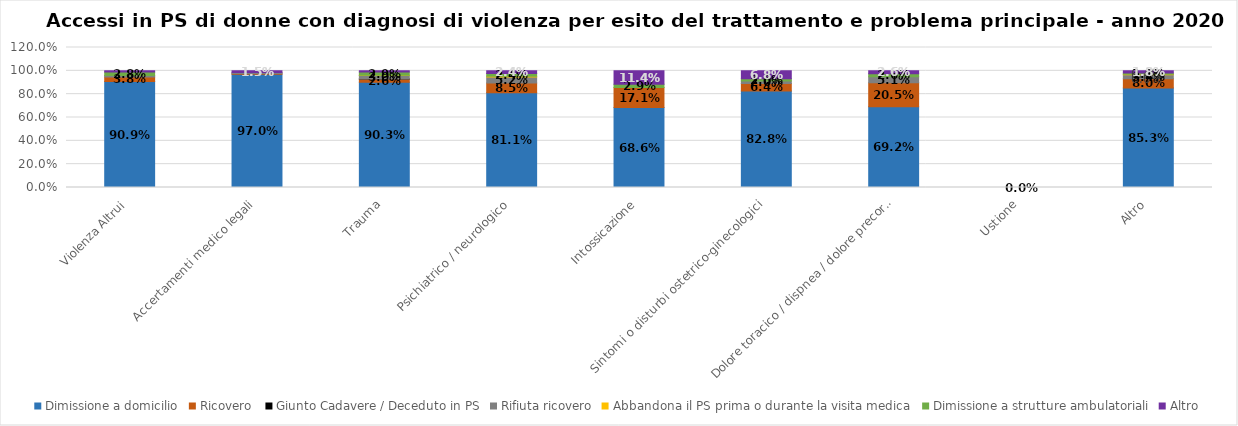
| Category | Dimissione a domicilio | Ricovero  | Giunto Cadavere / Deceduto in PS | Rifiuta ricovero | Abbandona il PS prima o durante la visita medica  | Dimissione a strutture ambulatoriali | Altro |
|---|---|---|---|---|---|---|---|
| Violenza Altrui | 0.909 | 0.038 | 0 | 0.014 | 0 | 0.028 | 0.011 |
| Accertamenti medico legali | 0.97 | 0.007 | 0 | 0.007 | 0 | 0 | 0.015 |
| Trauma | 0.903 | 0.026 | 0 | 0.03 | 0.002 | 0.029 | 0.01 |
| Psichiatrico / neurologico | 0.811 | 0.085 | 0 | 0.052 | 0.005 | 0.024 | 0.024 |
| Intossicazione | 0.686 | 0.171 | 0 | 0 | 0 | 0.029 | 0.114 |
| Sintomi o disturbi ostetrico-ginecologici | 0.828 | 0.064 | 0 | 0.02 | 0 | 0.02 | 0.068 |
| Dolore toracico / dispnea / dolore precordiale | 0.692 | 0.205 | 0 | 0.051 | 0 | 0.026 | 0.026 |
| Ustione | 0 | 0 | 0 | 0 | 0 | 0 | 0 |
| Altro | 0.853 | 0.08 | 0 | 0.034 | 0.004 | 0.012 | 0.018 |